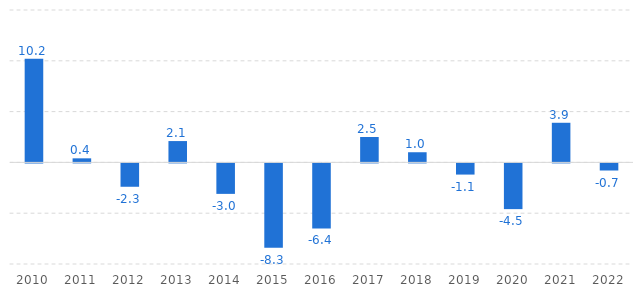
| Category | PIM-PF |
|---|---|
| 2010.0 | 10.2 |
| 2011.0 | 0.4 |
| 2012.0 | -2.3 |
| 2013.0 | 2.1 |
| 2014.0 | -3 |
| 2015.0 | -8.3 |
| 2016.0 | -6.4 |
| 2017.0 | 2.5 |
| 2018.0 | 1 |
| 2019.0 | -1.1 |
| 2020.0 | -4.5 |
| 2021.0 | 3.9 |
| 2022.0 | -0.7 |